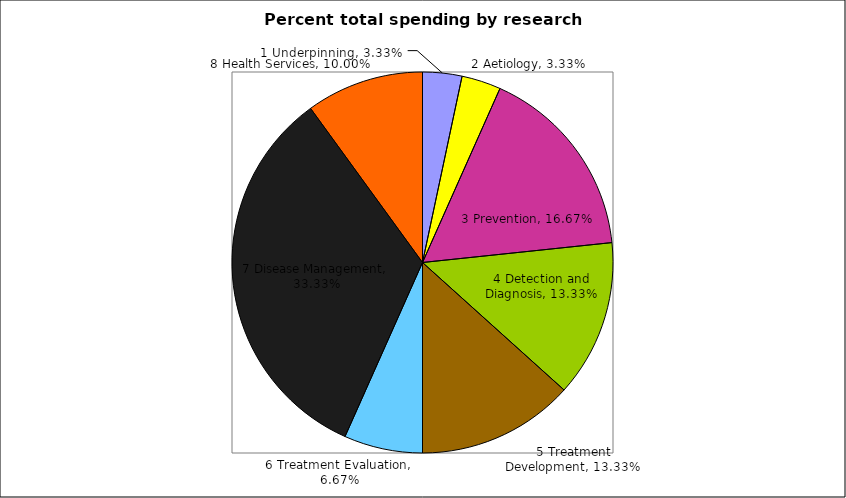
| Category | Sum of Amount_Total | Sum of N |
|---|---|---|
| 1 Underpinning | 0.033 | 0.5 |
| 2 Aetiology | 0.033 | 0.5 |
| 3 Prevention | 0.167 | 1 |
| 4 Detection and Diagnosis | 0.133 | 0.5 |
| 5 Treatment Development | 0.133 | 0.5 |
| 6 Treatment Evaluation | 0.067 | 0.5 |
| 7 Disease Management | 0.333 | 1 |
| 8 Health Services | 0.1 | 0.5 |